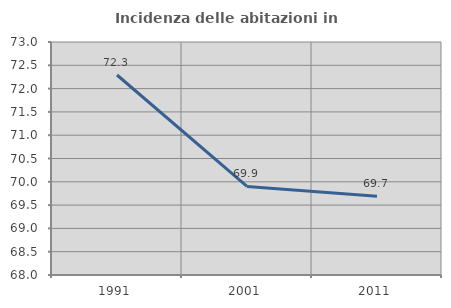
| Category | Incidenza delle abitazioni in proprietà  |
|---|---|
| 1991.0 | 72.292 |
| 2001.0 | 69.9 |
| 2011.0 | 69.689 |